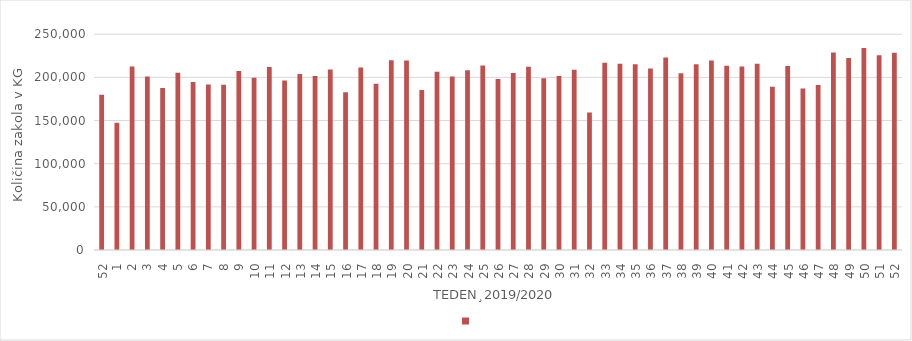
| Category | Series 1 |
|---|---|
| 52.0 | 179892 |
| 1.0 | 147387 |
| 2.0 | 212512 |
| 3.0 | 201188 |
| 4.0 | 187631 |
| 5.0 | 205328 |
| 6.0 | 194594 |
| 7.0 | 191685 |
| 8.0 | 191628 |
| 9.0 | 207392 |
| 10.0 | 199612 |
| 11.0 | 211919 |
| 12.0 | 196550 |
| 13.0 | 203833 |
| 14.0 | 201585 |
| 15.0 | 209155 |
| 16.0 | 182682 |
| 17.0 | 211431 |
| 18.0 | 192667 |
| 19.0 | 219758 |
| 20.0 | 219650 |
| 21.0 | 185539 |
| 22.0 | 206699 |
| 23.0 | 200992 |
| 24.0 | 208331 |
| 25.0 | 213854 |
| 26.0 | 198112 |
| 27.0 | 205190 |
| 28.0 | 212302 |
| 29.0 | 198886 |
| 30.0 | 201750 |
| 31.0 | 208870 |
| 32.0 | 159190 |
| 33.0 | 216968 |
| 34.0 | 215695 |
| 35.0 | 215158 |
| 36.0 | 210292 |
| 37.0 | 223014 |
| 38.0 | 204841 |
| 39.0 | 215288 |
| 40.0 | 219701 |
| 41.0 | 213427 |
| 42.0 | 212584 |
| 43.0 | 215784 |
| 44.0 | 189285 |
| 45.0 | 213206 |
| 46.0 | 187034 |
| 47.0 | 191242 |
| 48.0 | 228853 |
| 49.0 | 222368 |
| 50.0 | 234065 |
| 51.0 | 225649 |
| 52.0 | 228613 |